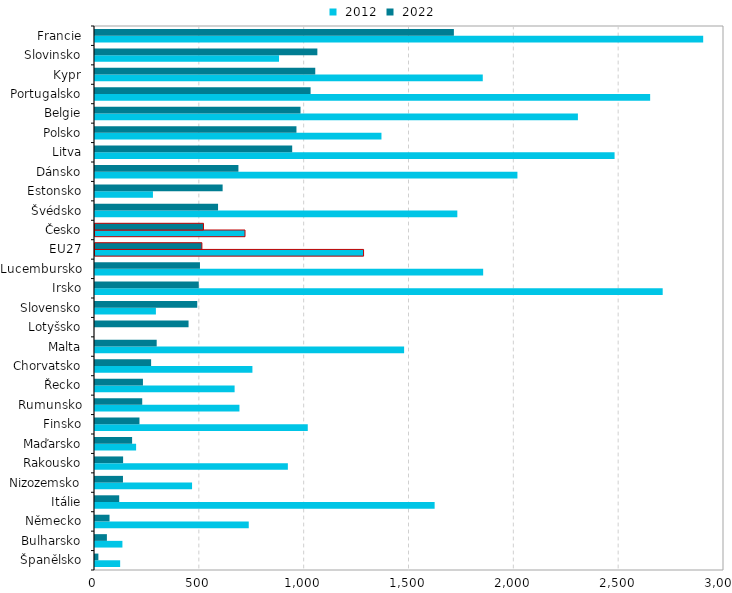
| Category |  2012 |  2022 |
|---|---|---|
| Španělsko | 119.995 | 16.104 |
| Bulharsko | 130.759 | 56.74 |
| Německo | 733.332 | 69.246 |
| Itálie | 1619.888 | 115.403 |
| Nizozemsko | 462.943 | 133.409 |
| Rakousko | 919.839 | 134.074 |
| Maďarsko | 196.067 | 176.986 |
| Finsko | 1014.803 | 212.065 |
| Rumunsko | 688.927 | 225.237 |
| Řecko | 665.869 | 228.682 |
| Chorvatsko | 750.788 | 267.634 |
| Malta | 1474.337 | 294.234 |
| Lotyšsko | 0 | 446.191 |
| Slovensko | 290.471 | 487.605 |
| Irsko | 2707.586 | 494.938 |
| Lucembursko | 1851.353 | 500.615 |
| EU27 | 1280.947 | 509.81 |
| Česko | 715.437 | 517.277 |
| Švédsko | 1728.104 | 586.894 |
| Estonsko | 276.393 | 608.718 |
| Dánsko | 2014.741 | 684.062 |
| Litva | 2478.117 | 940.541 |
| Polsko | 1366.242 | 960.871 |
| Belgie | 2303.183 | 980.262 |
| Portugalsko | 2647.776 | 1028.305 |
| Kypr | 1849.472 | 1050.496 |
| Slovinsko | 877.753 | 1060.522 |
| Francie | 2900.728 | 1711.663 |